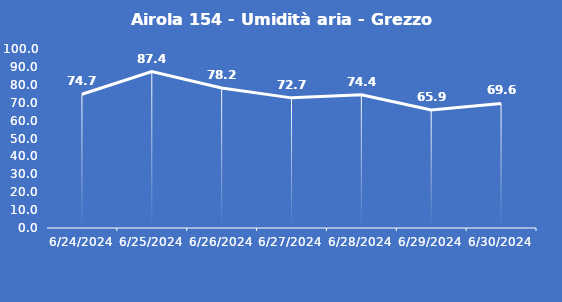
| Category | Airola 154 - Umidità aria - Grezzo (%) |
|---|---|
| 6/24/24 | 74.7 |
| 6/25/24 | 87.4 |
| 6/26/24 | 78.2 |
| 6/27/24 | 72.7 |
| 6/28/24 | 74.4 |
| 6/29/24 | 65.9 |
| 6/30/24 | 69.6 |